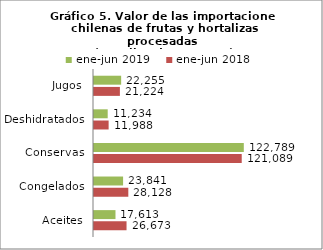
| Category | ene-jun 2018 | ene-jun 2019 |
|---|---|---|
| Aceites | 26672821.35 | 17612673.25 |
| Congelados | 28128120.81 | 23841338.18 |
| Conservas | 121088651.46 | 122788602.94 |
| Deshidratados | 11988490.35 | 11233517.7 |
| Jugos | 21223871.92 | 22255054.04 |